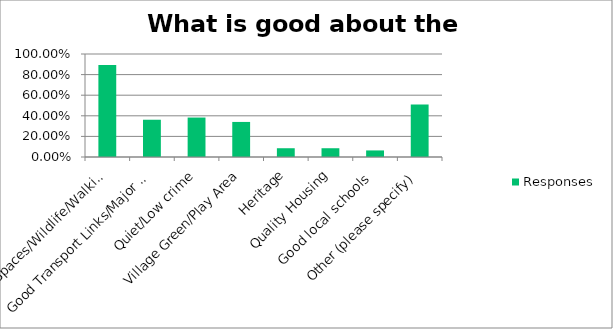
| Category | Responses |
|---|---|
| Open Spaces/Wildlife/Walking/SANGS/Canal | 0.894 |
| Good Transport Links/Major road Links/Major Rail Links | 0.362 |
| Quiet/Low crime | 0.383 |
| Village Green/Play Area | 0.34 |
| Heritage | 0.085 |
| Quality Housing | 0.085 |
| Good local schools | 0.064 |
| Other (please specify) | 0.511 |